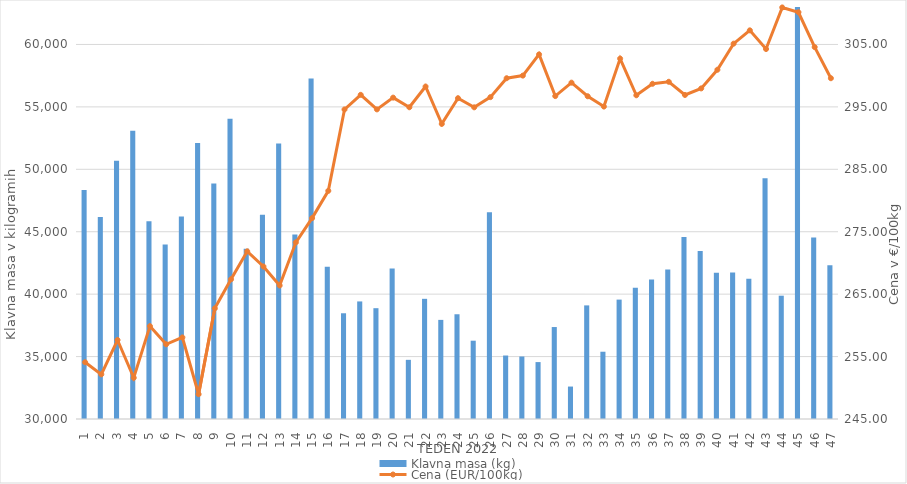
| Category | Klavna masa (kg) |
|---|---|
| 1.0 | 48349 |
| 2.0 | 46187 |
| 3.0 | 50692 |
| 4.0 | 53081 |
| 5.0 | 45844 |
| 6.0 | 43982 |
| 7.0 | 46227 |
| 8.0 | 52099 |
| 9.0 | 48872 |
| 10.0 | 54045 |
| 11.0 | 43645 |
| 12.0 | 46350 |
| 13.0 | 52061 |
| 14.0 | 44774 |
| 15.0 | 57268 |
| 16.0 | 42191 |
| 17.0 | 38469 |
| 18.0 | 39417 |
| 19.0 | 38876 |
| 20.0 | 42047 |
| 21.0 | 34739 |
| 22.0 | 39626 |
| 23.0 | 37939 |
| 24.0 | 38390 |
| 25.0 | 36272 |
| 26.0 | 46553 |
| 27.0 | 35085 |
| 28.0 | 35007 |
| 29.0 | 34559 |
| 30.0 | 37366 |
| 31.0 | 32599 |
| 32.0 | 39100 |
| 33.0 | 35388 |
| 34.0 | 39563 |
| 35.0 | 40507 |
| 36.0 | 41176 |
| 37.0 | 41983 |
| 38.0 | 44572 |
| 39.0 | 43447 |
| 40.0 | 41711 |
| 41.0 | 41736 |
| 42.0 | 41239 |
| 43.0 | 49284 |
| 44.0 | 39877 |
| 45.0 | 63668 |
| 46.0 | 44528 |
| 47.0 | 42319 |